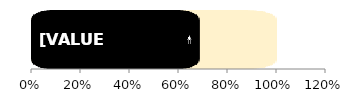
| Category | total | Men |
|---|---|---|
| 0 | 1 | 0.685 |